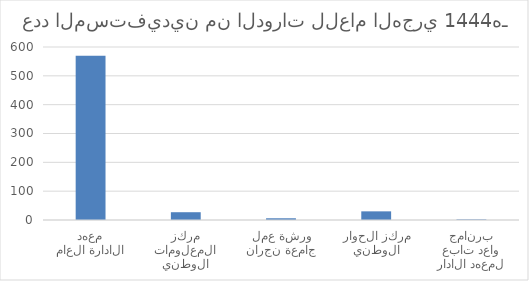
| Category | عدد المستفيدين من الدورة |
|---|---|
| معهد الادارة العامة | 570 |
| مركز المعلومات الوطني | 27 |
| ورشة عمل جامعة نجران | 6 |
| مركز الحوار الوطني | 30 |
| برنامج واعد تابع لمعهد الادارة | 2 |